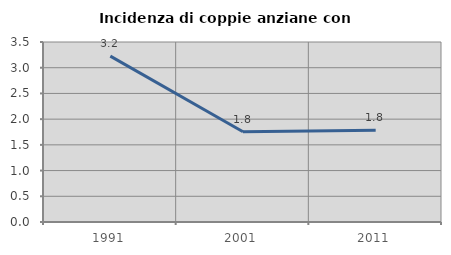
| Category | Incidenza di coppie anziane con figli |
|---|---|
| 1991.0 | 3.226 |
| 2001.0 | 1.754 |
| 2011.0 | 1.786 |